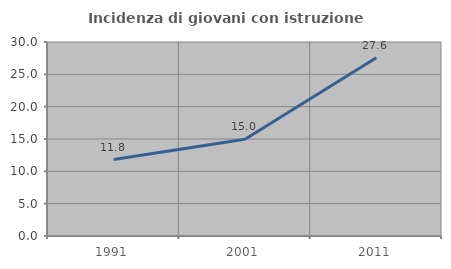
| Category | Incidenza di giovani con istruzione universitaria |
|---|---|
| 1991.0 | 11.821 |
| 2001.0 | 14.953 |
| 2011.0 | 27.551 |